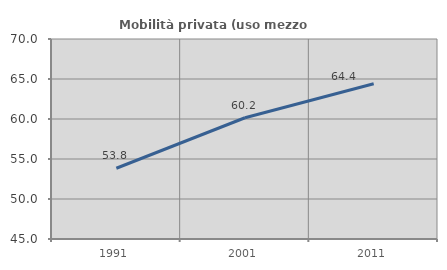
| Category | Mobilità privata (uso mezzo privato) |
|---|---|
| 1991.0 | 53.846 |
| 2001.0 | 60.154 |
| 2011.0 | 64.412 |